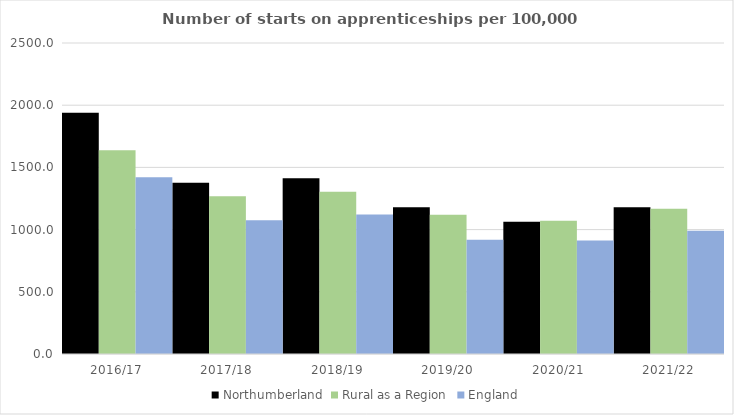
| Category | Northumberland | Rural as a Region | England |
|---|---|---|---|
| 2016/17 | 1939 | 1638.789 | 1420 |
| 2017/18 | 1376 | 1267.474 | 1075 |
| 2018/19 | 1413 | 1304.57 | 1122 |
| 2019/20 | 1179 | 1119.662 | 918 |
| 2020/21 | 1064 | 1070.748 | 912 |
| 2021/22 | 1180 | 1167.68 | 991 |